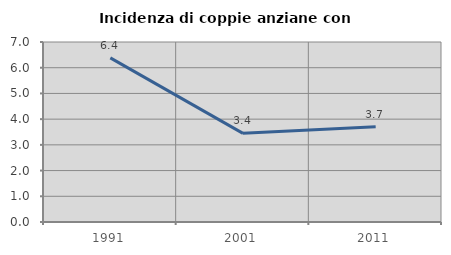
| Category | Incidenza di coppie anziane con figli |
|---|---|
| 1991.0 | 6.383 |
| 2001.0 | 3.448 |
| 2011.0 | 3.704 |